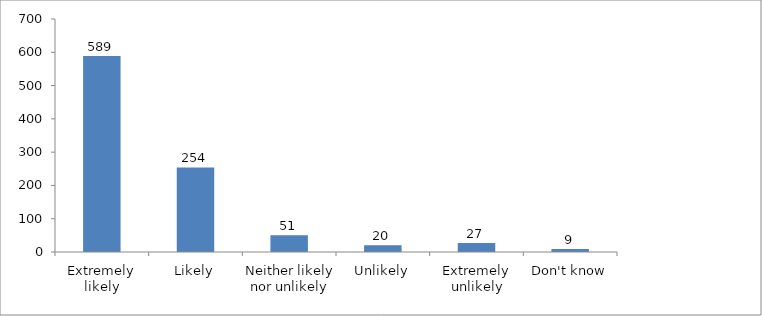
| Category | Series 0 |
|---|---|
| Extremely likely | 589 |
| Likely | 254 |
| Neither likely nor unlikely | 50 |
| Unlikely | 20 |
| Extremely unlikely | 27 |
| Don't know | 9 |